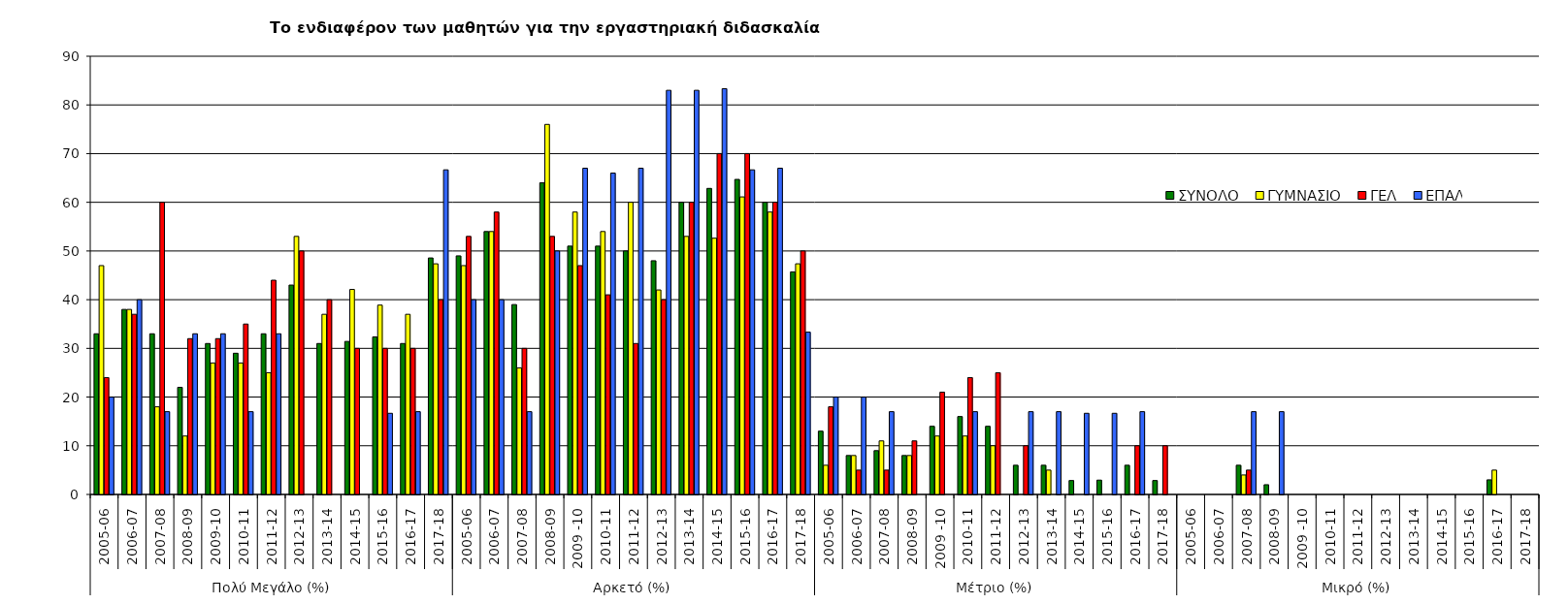
| Category | ΣΥΝΟΛΟ | ΓΥΜΝΑΣΙΟ | ΓΕΛ | ΕΠΑΛ |
|---|---|---|---|---|
| 0 | 33 | 47 | 24 | 20 |
| 1 | 38 | 38 | 37 | 40 |
| 2 | 33 | 18 | 60 | 17 |
| 3 | 22 | 12 | 32 | 33 |
| 4 | 31 | 27 | 32 | 33 |
| 5 | 29 | 27 | 35 | 17 |
| 6 | 33 | 25 | 44 | 33 |
| 7 | 43 | 53 | 50 | 0 |
| 8 | 31 | 37 | 40 | 0 |
| 9 | 31.429 | 42.105 | 30 | 0 |
| 10 | 32.353 | 38.889 | 30 | 16.667 |
| 11 | 31 | 37 | 30 | 17 |
| 12 | 48.571 | 47.368 | 40 | 66.667 |
| 13 | 49 | 47 | 53 | 40 |
| 14 | 54 | 54 | 58 | 40 |
| 15 | 39 | 26 | 30 | 17 |
| 16 | 64 | 76 | 53 | 50 |
| 17 | 51 | 58 | 47 | 67 |
| 18 | 51 | 54 | 41 | 66 |
| 19 | 50 | 60 | 31 | 67 |
| 20 | 48 | 42 | 40 | 83 |
| 21 | 60 | 53 | 60 | 83 |
| 22 | 62.857 | 52.632 | 70 | 83.333 |
| 23 | 64.706 | 61.111 | 70 | 66.667 |
| 24 | 60 | 58 | 60 | 67 |
| 25 | 45.714 | 47.368 | 50 | 33.333 |
| 26 | 13 | 6 | 18 | 20 |
| 27 | 8 | 8 | 5 | 20 |
| 28 | 9 | 11 | 5 | 17 |
| 29 | 8 | 8 | 11 | 0 |
| 30 | 14 | 12 | 21 | 0 |
| 31 | 16 | 12 | 24 | 17 |
| 32 | 14 | 10 | 25 | 0 |
| 33 | 6 | 0 | 10 | 17 |
| 34 | 6 | 5 | 0 | 17 |
| 35 | 2.857 | 0 | 0 | 16.667 |
| 36 | 2.941 | 0 | 0 | 16.667 |
| 37 | 6 | 0 | 10 | 17 |
| 38 | 2.857 | 0 | 10 | 0 |
| 39 | 0 | 0 | 0 | 0 |
| 40 | 0 | 0 | 0 | 0 |
| 41 | 6 | 4 | 5 | 17 |
| 42 | 2 | 0 | 0 | 17 |
| 43 | 0 | 0 | 0 | 0 |
| 44 | 0 | 0 | 0 | 0 |
| 45 | 0 | 0 | 0 | 0 |
| 46 | 0 | 0 | 0 | 0 |
| 47 | 0 | 0 | 0 | 0 |
| 48 | 0 | 0 | 0 | 0 |
| 49 | 0 | 0 | 0 | 0 |
| 50 | 3 | 5 | 0 | 0 |
| 51 | 0 | 0 | 0 | 0 |